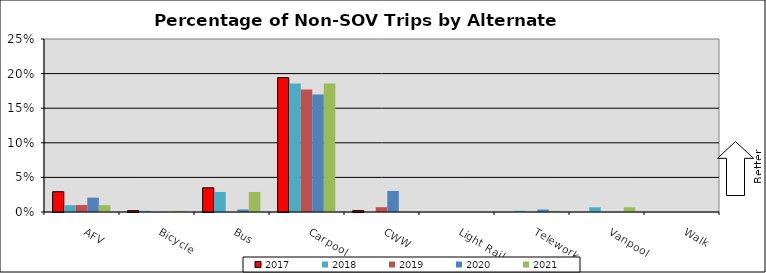
| Category | 2017 | 2018 | 2019 | 2020 | 2021 |
|---|---|---|---|---|---|
| AFV | 0.029 | 0.01 | 0.01 | 0.021 | 0.01 |
| Bicycle | 0.002 | 0.002 | 0 | 0 | 0.002 |
| Bus | 0.035 | 0.029 | 0 | 0.004 | 0.029 |
| Carpool | 0.194 | 0.186 | 0.177 | 0.17 | 0.186 |
| CWW | 0.002 | 0 | 0.007 | 0.03 | 0 |
| Light Rail | 0 | 0 | 0 | 0 | 0 |
| Telework | 0 | 0.002 | 0 | 0.004 | 0.002 |
| Vanpool | 0 | 0.007 | 0 | 0 | 0.007 |
| Walk | 0 | 0 | 0 | 0 | 0 |